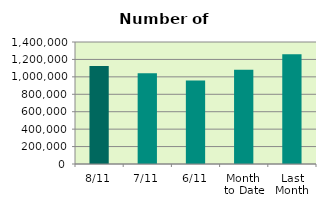
| Category | Series 0 |
|---|---|
| 8/11 | 1125850 |
| 7/11 | 1042400 |
| 6/11 | 959026 |
| Month 
to Date | 1080443.333 |
| Last
Month | 1260789.391 |